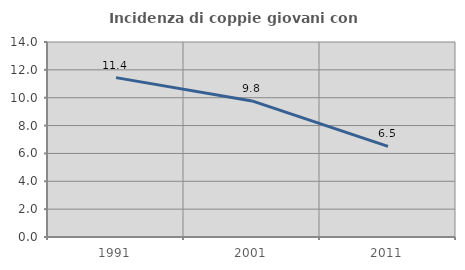
| Category | Incidenza di coppie giovani con figli |
|---|---|
| 1991.0 | 11.441 |
| 2001.0 | 9.769 |
| 2011.0 | 6.509 |